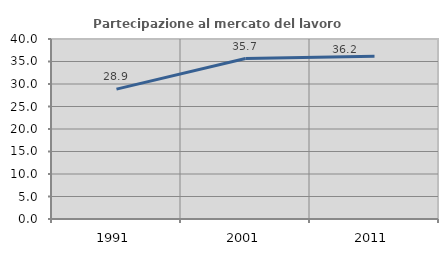
| Category | Partecipazione al mercato del lavoro  femminile |
|---|---|
| 1991.0 | 28.854 |
| 2001.0 | 35.656 |
| 2011.0 | 36.194 |